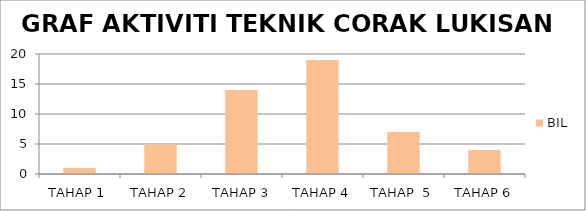
| Category | BIL |
|---|---|
| TAHAP 1 | 1 |
| TAHAP 2 | 5 |
|  TAHAP 3 | 14 |
| TAHAP 4 | 19 |
| TAHAP  5 | 7 |
| TAHAP 6 | 4 |